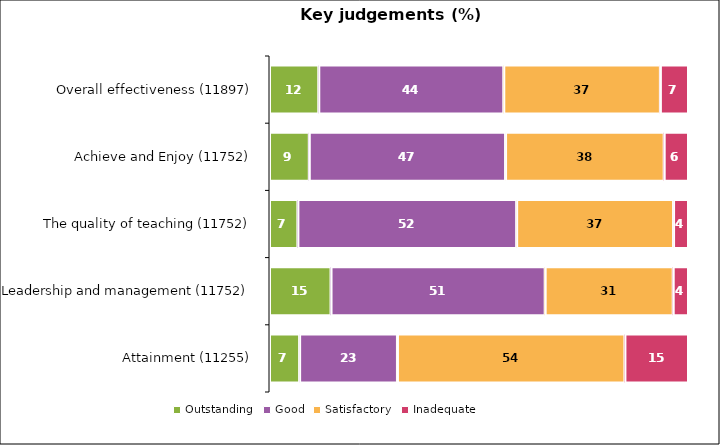
| Category | Outstanding | Good | Satisfactory | Inadequate |
|---|---|---|---|---|
| Overall effectiveness (11897) | 11.759 | 44.154 | 37.379 | 6.708 |
| Achieve and Enjoy (11752) | 9.496 | 46.843 | 37.857 | 5.803 |
| The quality of teaching (11752) | 6.773 | 52.212 | 37.449 | 3.565 |
| Leadership and management (11752) | 14.687 | 51.106 | 30.557 | 3.65 |
| Attainment (11255) | 7.188 | 23.35 | 54.287 | 15.175 |